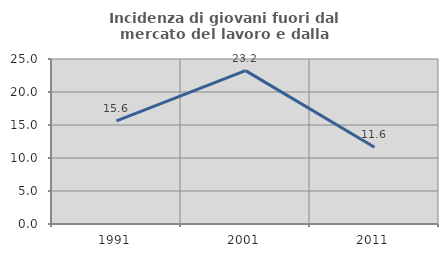
| Category | Incidenza di giovani fuori dal mercato del lavoro e dalla formazione  |
|---|---|
| 1991.0 | 15.625 |
| 2001.0 | 23.243 |
| 2011.0 | 11.622 |